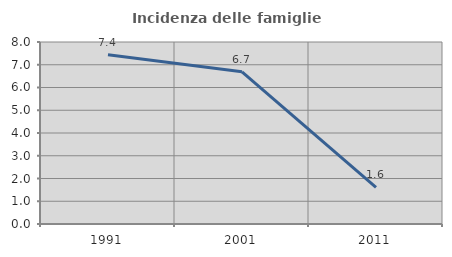
| Category | Incidenza delle famiglie numerose |
|---|---|
| 1991.0 | 7.443 |
| 2001.0 | 6.689 |
| 2011.0 | 1.613 |